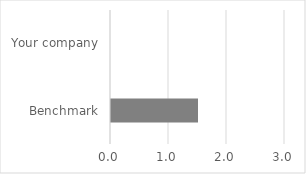
| Category | Operational flexibility/strengthening compliance |
|---|---|
| Benchmark | 1.5 |
| Your company | 0 |